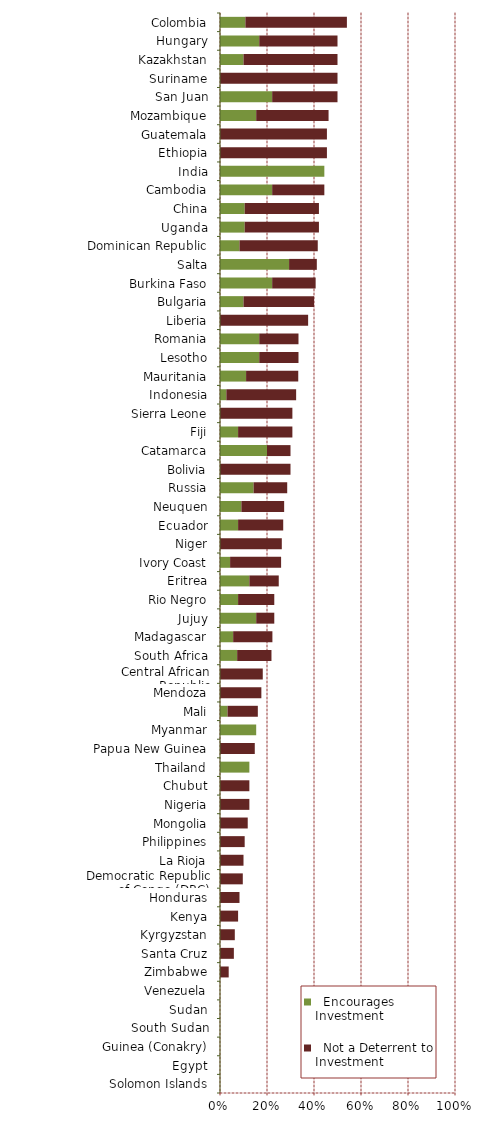
| Category |   Encourages Investment |   Not a Deterrent to Investment |
|---|---|---|
| Solomon Islands | 0 | 0 |
| Egypt | 0 | 0 |
| Guinea (Conakry) | 0 | 0 |
| South Sudan | 0 | 0 |
| Sudan | 0 | 0 |
| Venezuela | 0 | 0 |
| Zimbabwe | 0 | 0.037 |
| Santa Cruz | 0 | 0.059 |
| Kyrgyzstan | 0 | 0.063 |
| Kenya | 0 | 0.077 |
| Honduras | 0 | 0.083 |
| Democratic Republic of Congo (DRC) | 0 | 0.097 |
| La Rioja | 0 | 0.1 |
| Philippines | 0 | 0.105 |
| Mongolia | 0 | 0.118 |
| Nigeria | 0 | 0.125 |
| Chubut | 0 | 0.125 |
| Thailand | 0.125 | 0 |
| Papua New Guinea | 0 | 0.148 |
| Myanmar | 0.154 | 0 |
| Mali | 0.032 | 0.129 |
| Mendoza | 0 | 0.176 |
| Central African Republic | 0 | 0.182 |
| South Africa | 0.073 | 0.146 |
| Madagascar | 0.056 | 0.167 |
| Jujuy | 0.154 | 0.077 |
| Rio Negro | 0.077 | 0.154 |
| Eritrea | 0.125 | 0.125 |
| Ivory Coast | 0.043 | 0.217 |
| Niger | 0 | 0.263 |
| Ecuador | 0.077 | 0.192 |
| Neuquen | 0.091 | 0.182 |
| Russia | 0.143 | 0.143 |
| Bolivia | 0 | 0.3 |
| Catamarca | 0.2 | 0.1 |
| Fiji | 0.077 | 0.231 |
| Sierra Leone | 0 | 0.308 |
| Indonesia | 0.027 | 0.297 |
| Mauritania | 0.111 | 0.222 |
| Lesotho | 0.167 | 0.167 |
| Romania | 0.167 | 0.167 |
| Liberia | 0 | 0.375 |
| Bulgaria | 0.1 | 0.3 |
| Burkina Faso | 0.222 | 0.185 |
| Salta | 0.294 | 0.118 |
| Dominican Republic | 0.083 | 0.333 |
| Uganda | 0.105 | 0.316 |
| China | 0.105 | 0.316 |
| Cambodia | 0.222 | 0.222 |
| India | 0.444 | 0 |
| Ethiopia | 0 | 0.455 |
| Guatemala | 0 | 0.455 |
| Mozambique | 0.154 | 0.308 |
| San Juan | 0.222 | 0.278 |
| Suriname | 0 | 0.5 |
| Kazakhstan | 0.1 | 0.4 |
| Hungary | 0.167 | 0.333 |
| Colombia | 0.108 | 0.432 |